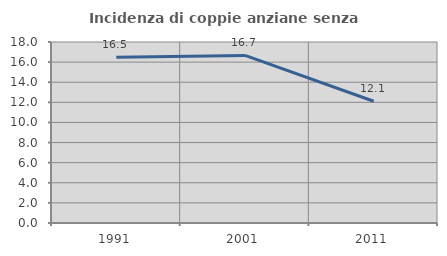
| Category | Incidenza di coppie anziane senza figli  |
|---|---|
| 1991.0 | 16.495 |
| 2001.0 | 16.667 |
| 2011.0 | 12.105 |